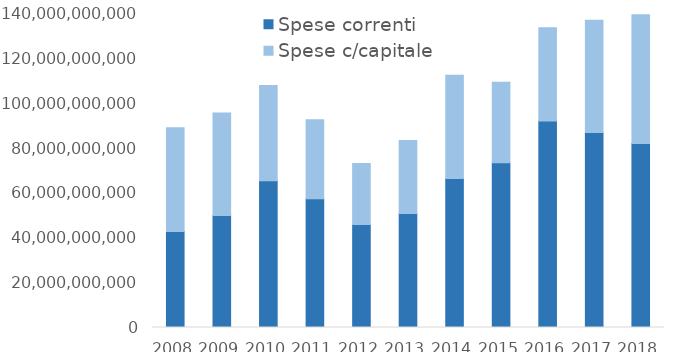
| Category | Spese correnti | Spese c/capitale |
|---|---|---|
| 2008.0 | 42893953000 | 46442360000 |
| 2009.0 | 50059217000 | 45866639000 |
| 2010.0 | 65621000000 | 42582000000 |
| 2011.0 | 57583816390.88 | 35380027229.73 |
| 2012.0 | 46058542143.35 | 27288631413.08 |
| 2013.0 | 51042043323.31 | 32608325232.85 |
| 2014.0 | 66601643726.18 | 46189902501.64 |
| 2015.0 | 73736463947.24 | 35954785504.87 |
| 2016.0 | 92316792259.88 | 41756911077.56 |
| 2017.0 | 87211420097.46 | 50218793198.99 |
| 2018.0 | 82319023262.39 | 57536065822.9 |